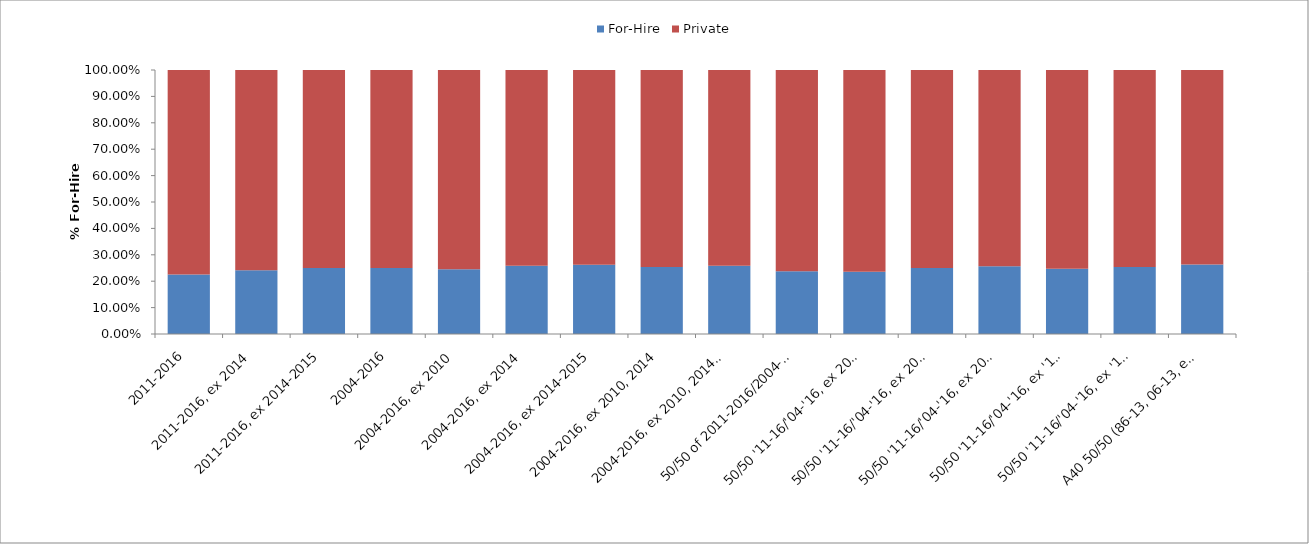
| Category | For-Hire | Private |
|---|---|---|
| 2011-2016 | 0.226 | 0.774 |
| 2011-2016, ex 2014 | 0.241 | 0.759 |
| 2011-2016, ex 2014-2015 | 0.25 | 0.75 |
| 2004-2016 | 0.25 | 0.75 |
| 2004-2016, ex 2010 | 0.246 | 0.754 |
| 2004-2016, ex 2014 | 0.258 | 0.742 |
| 2004-2016, ex 2014-2015 | 0.263 | 0.737 |
| 2004-2016, ex 2010, 2014 | 0.254 | 0.746 |
| 2004-2016, ex 2010, 2014, 2015 | 0.258 | 0.742 |
| 50/50 of 2011-2016/2004-2016 | 0.238 | 0.762 |
| 50/50 '11-16/'04-'16, ex 2010 | 0.236 | 0.764 |
| 50/50 '11-16/'04-'16, ex 2014 | 0.25 | 0.75 |
| 50/50 '11-16/'04-'16, ex 2014-2015 | 0.256 | 0.744 |
| 50/50 '11-16/'04-'16, ex '10, '14 | 0.248 | 0.752 |
| 50/50 '11-16/'04-'16, ex '10, '14, '15 | 0.254 | 0.746 |
| A40 50/50 (86-13, 06-13, ex '10) | 0.263 | 0.737 |